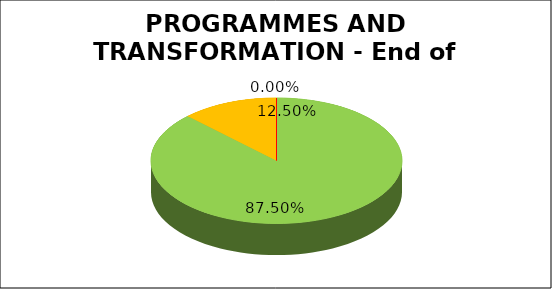
| Category | Series 0 |
|---|---|
| Green | 0.875 |
| Amber | 0.125 |
| Red | 0 |